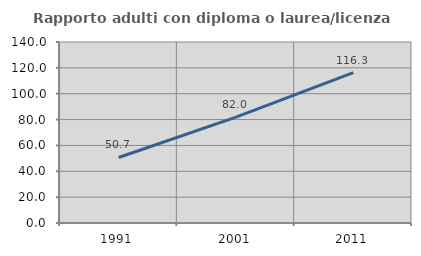
| Category | Rapporto adulti con diploma o laurea/licenza media  |
|---|---|
| 1991.0 | 50.676 |
| 2001.0 | 81.951 |
| 2011.0 | 116.304 |